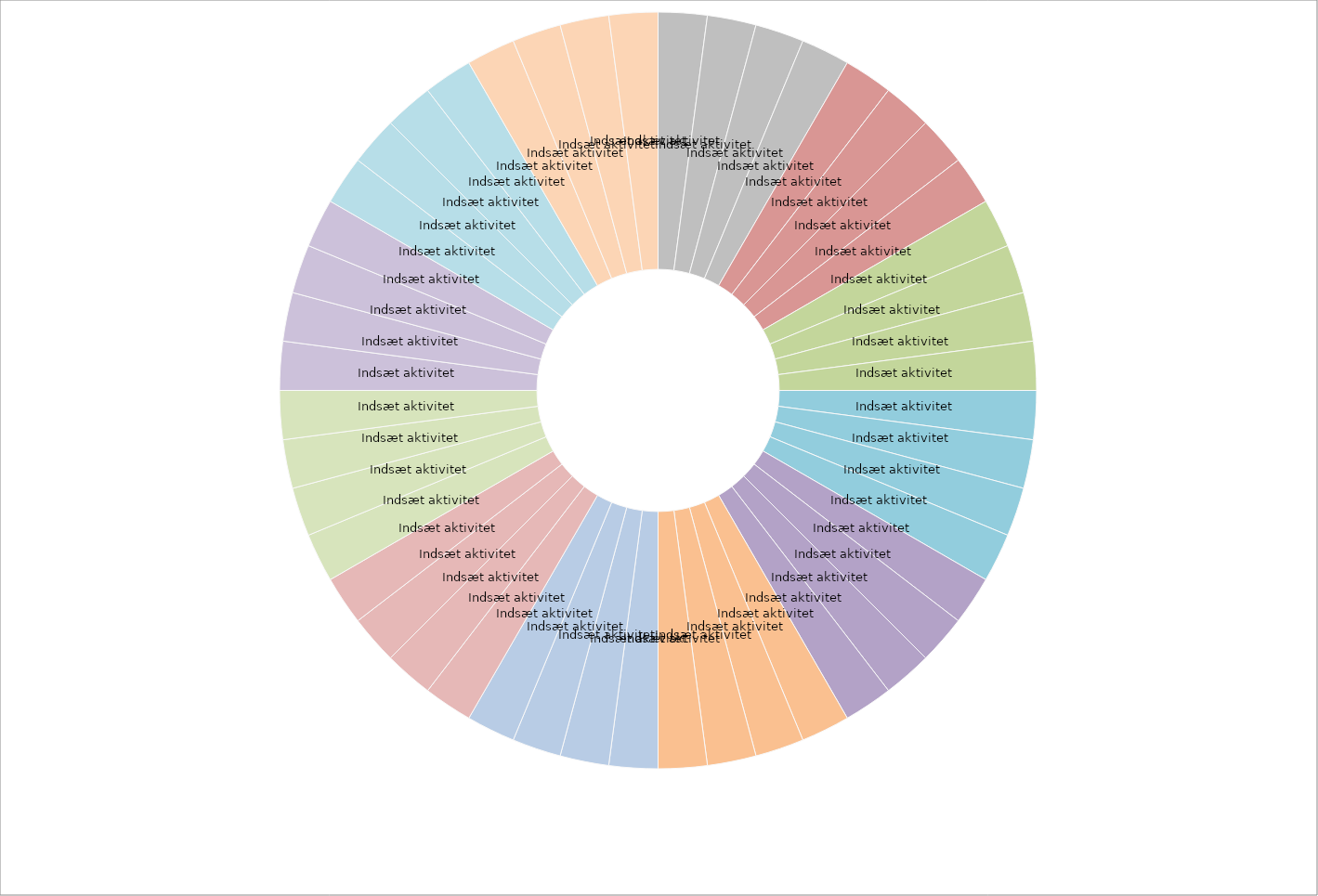
| Category | Series 0 |
|---|---|
| Indsæt aktivitet | 10 |
| Indsæt aktivitet | 10 |
| Indsæt aktivitet | 10 |
| Indsæt aktivitet | 10 |
| Indsæt aktivitet | 10 |
| Indsæt aktivitet | 10 |
| Indsæt aktivitet | 10 |
| Indsæt aktivitet | 10 |
| Indsæt aktivitet | 10 |
| Indsæt aktivitet | 10 |
| Indsæt aktivitet | 10 |
| Indsæt aktivitet | 10 |
| Indsæt aktivitet | 10 |
| Indsæt aktivitet | 10 |
| Indsæt aktivitet | 10 |
| Indsæt aktivitet | 10 |
| Indsæt aktivitet  | 10 |
| Indsæt aktivitet | 10 |
| Indsæt aktivitet | 10 |
| Indsæt aktivitet | 10 |
| Indsæt aktivitet | 10 |
| Indsæt aktivitet | 10 |
| Indsæt aktivitet | 10 |
| Indsæt aktivitet | 10 |
| Indsæt aktivitet | 10 |
| Indsæt aktivitet | 10 |
| Indsæt aktivitet | 10 |
| Indsæt aktivitet | 10 |
| Indsæt aktivitet | 10 |
| Indsæt aktivitet | 10 |
| Indsæt aktivitet | 10 |
| Indsæt aktivitet | 10 |
| Indsæt aktivitet | 10 |
| Indsæt aktivitet | 10 |
| Indsæt aktivitet | 10 |
| Indsæt aktivitet | 10 |
| Indsæt aktivitet | 10 |
| Indsæt aktivitet | 10 |
| Indsæt aktivitet | 10 |
| Indsæt aktivitet | 10 |
| Indsæt aktivitet | 10 |
| Indsæt aktivitet | 10 |
| Indsæt aktivitet | 10 |
| Indsæt aktivitet | 10 |
| Indsæt aktivitet | 10 |
| Indsæt aktivitet | 10 |
| Indsæt aktivitet | 10 |
| Indsæt aktivitet | 10 |